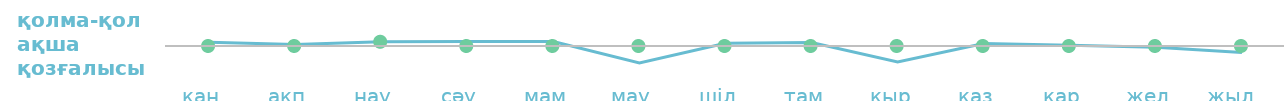
| Category | Ақша ағыны |
|---|---|
| қаң  | 169 |
| ақп  | 69 |
| нау  | 192 |
| сәу  | 199 |
| мам  | 204 |
| мау  | -771 |
| шіл  | 124 |
| там  | 154 |
| қыр  | -721 |
| қаз  | 109 |
| қар  | 34 |
| жел  | -61 |
| жыл   | -299 |